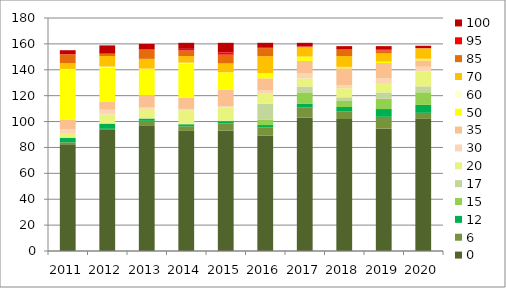
| Category | 0 | 6 | 12 | 15 | 17 | 20 | 30 | 35 | 50 | 60 | 70 | 85 | 95 | 100 |
|---|---|---|---|---|---|---|---|---|---|---|---|---|---|---|
| 2011.0 | 82.492 | 1.444 | 3.536 | 0 | 0.192 | 2.86 | 3.667 | 7.184 | 38.657 | 0.602 | 4.368 | 6.813 | 0.234 | 3.056 |
| 2012.0 | 93.498 | 0.889 | 3.979 | 0 | 0.179 | 6.967 | 3.617 | 6.055 | 26.594 | 0.71 | 8.145 | 1.654 | 0.578 | 5.958 |
| 2013.0 | 96.598 | 3.962 | 1.806 | 0 | 0.008 | 7.432 | 1.075 | 9.354 | 20.427 | 0.213 | 7.553 | 7.059 | 0.176 | 4.309 |
| 2014.0 | 92.764 | 3.548 | 1.624 | 0 | 0 | 10.9 | 0.946 | 8.551 | 26.681 | 0.462 | 5.075 | 4.322 | 1.292 | 4.667 |
| 2015.0 | 93.074 | 5.469 | 1.733 | 0.41 | 0 | 10.314 | 0.844 | 12.854 | 13.321 | 0.07 | 6.76 | 6.802 | 1.784 | 7.397 |
| 2016.0 | 89.206 | 6.304 | 1.8 | 4.009 | 12.473 | 7.657 | 2.94 | 9.006 | 3.768 | 0.097 | 13.284 | 6.193 | 0.282 | 3.814 |
| 2017.0 | 103.143 | 7.621 | 2.87 | 8.4 | 5.066 | 6.257 | 3.744 | 9.757 | 3.273 | 0.061 | 7.119 | 0.521 | 0.23 | 2.77 |
| 2018.0 | 101.954 | 6.022 | 3.252 | 4.706 | 2.797 | 7.046 | 2.246 | 13.098 | 1.105 | 0.014 | 8.351 | 4.892 | 0.438 | 2.344 |
| 2019.0 | 94.482 | 9.163 | 6.03 | 8.021 | 4.797 | 6.612 | 4.439 | 11.66 | 1.048 | 0.014 | 6.374 | 2.324 | 0.542 | 2.761 |
| 2020.0 | 102.085 | 4.66 | 6.125 | 9.742 | 4.563 | 11.562 | 3.644 | 4.882 | 1.255 | 0.022 | 7.938 | 0.363 | 0 | 1.709 |